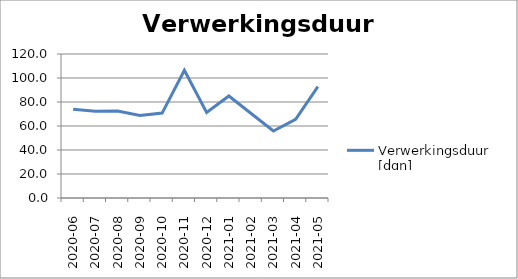
| Category | Verwerkingsduur [dgn] |
|---|---|
| 2020-06 | 73.877 |
| 2020-07 | 72.222 |
| 2020-08 | 72.468 |
| 2020-09 | 68.747 |
| 2020-10 | 70.743 |
| 2020-11 | 106.381 |
| 2020-12 | 71.284 |
| 2021-01 | 84.993 |
| 2021-02 | 70.413 |
| 2021-03 | 55.834 |
| 2021-04 | 65.618 |
| 2021-05 | 92.757 |